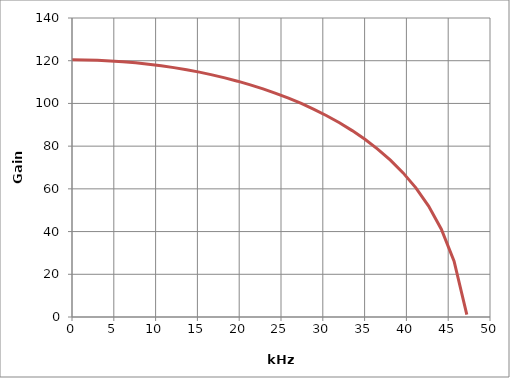
| Category | Series 1 |
|---|---|
| 0.0001 | 120.412 |
| 1.5234375 | 120.356 |
| 3.046875 | 120.189 |
| 4.5703125 | 119.909 |
| 6.09375 | 119.515 |
| 7.6171875 | 119.007 |
| 9.140625 | 118.381 |
| 10.6640625 | 117.636 |
| 12.1875 | 116.767 |
| 13.7109375 | 115.772 |
| 15.234375 | 114.645 |
| 16.7578125 | 113.382 |
| 18.28125 | 111.975 |
| 19.8046875 | 110.417 |
| 21.328125 | 108.698 |
| 22.8515625 | 106.809 |
| 24.375 | 104.736 |
| 25.8984375 | 102.464 |
| 27.421875 | 99.974 |
| 28.9453125 | 97.242 |
| 30.46875 | 94.241 |
| 31.9921875 | 90.933 |
| 33.515625 | 87.272 |
| 35.0390625 | 83.197 |
| 36.5625 | 78.625 |
| 38.0859375 | 73.44 |
| 39.609375 | 67.47 |
| 41.1328125 | 60.454 |
| 42.65625 | 51.949 |
| 44.1796875 | 41.132 |
| 45.703125 | 26.15 |
| 47.2265625 | 1.1 |